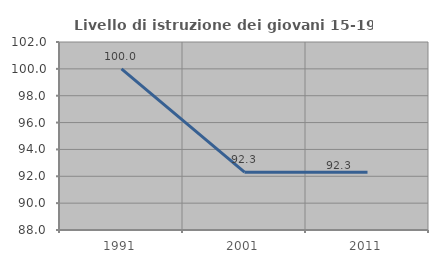
| Category | Livello di istruzione dei giovani 15-19 anni |
|---|---|
| 1991.0 | 100 |
| 2001.0 | 92.308 |
| 2011.0 | 92.308 |